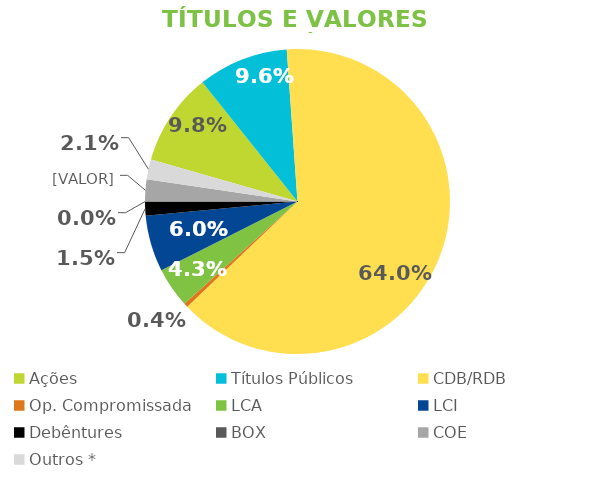
| Category | TVM |
|---|---|
| Ações | 0.098 |
| Títulos Públicos | 0.096 |
| CDB/RDB | 0.64 |
| Op. Compromissada | 0.004 |
| LCA | 0.043 |
| LCI | 0.06 |
| Debêntures | 0.015 |
| BOX | 0 |
| COE | 0.024 |
| Outros * | 0.021 |